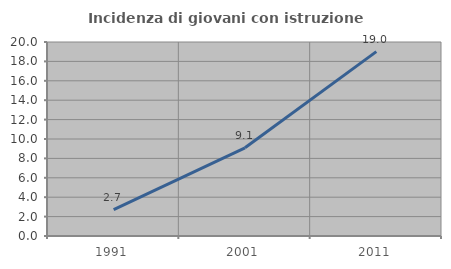
| Category | Incidenza di giovani con istruzione universitaria |
|---|---|
| 1991.0 | 2.727 |
| 2001.0 | 9.091 |
| 2011.0 | 19.01 |